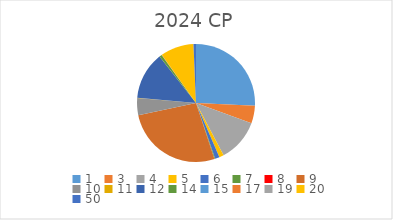
| Category | Series 0 |
|---|---|
| 1.0 | 2521262 |
| 3.0 | 469979 |
| 4.0 | 1143735 |
| 5.0 | 121965 |
| 6.0 | 120440 |
| 7.0 | 20000 |
| 8.0 | 0 |
| 9.0 | 2617373 |
| 10.0 | 453845 |
| 11.0 | 6000 |
| 12.0 | 1272799 |
| 14.0 | 69938 |
| 15.0 | 0 |
| 17.0 | 6954 |
| 19.0 | 0 |
| 20.0 | 893263 |
| 50.0 | 67105 |